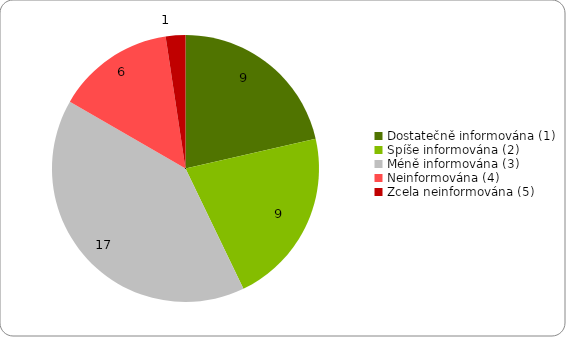
| Category | Series 0 |
|---|---|
| Dostatečně informována (1) | 9 |
| Spíše informována (2) | 9 |
| Méně informována (3) | 17 |
| Neinformována (4) | 6 |
| Zcela neinformována (5) | 1 |